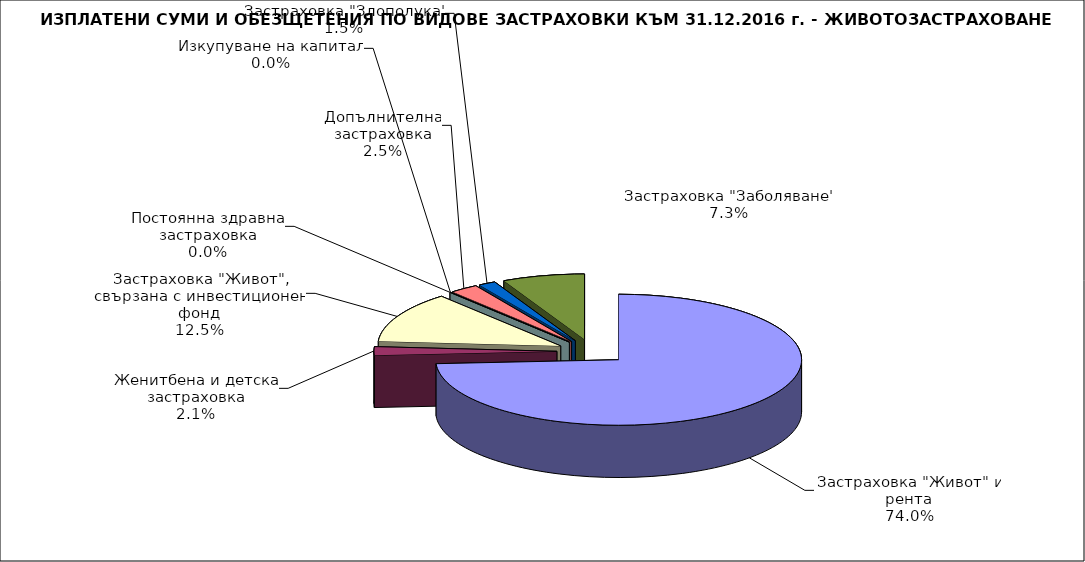
| Category | Series 0 |
|---|---|
| Застраховка "Живот" и рента | 0.74 |
| Женитбена и детска застраховка | 0.021 |
| Застраховка "Живот", свързана с инвестиционен фонд | 0.125 |
| Постоянна здравна застраховка | 0 |
| Изкупуване на капитал | 0 |
| Допълнителна застраховка | 0.025 |
| Застраховка "Злополука" | 0.015 |
| Застраховка "Заболяване" | 0.073 |